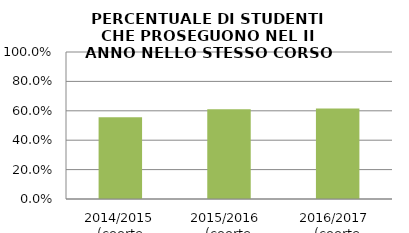
| Category | 2014/2015 (coorte 2013/14) 2015/2016  (coorte 2014/15) 2016/2017  (coorte 2015/16) |
|---|---|
| 2014/2015 (coorte 2013/14) | 0.556 |
| 2015/2016  (coorte 2014/15) | 0.611 |
| 2016/2017  (coorte 2015/16) | 0.615 |